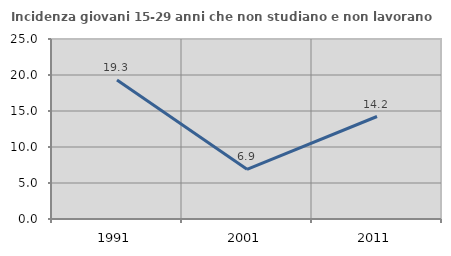
| Category | Incidenza giovani 15-29 anni che non studiano e non lavorano  |
|---|---|
| 1991.0 | 19.315 |
| 2001.0 | 6.907 |
| 2011.0 | 14.236 |